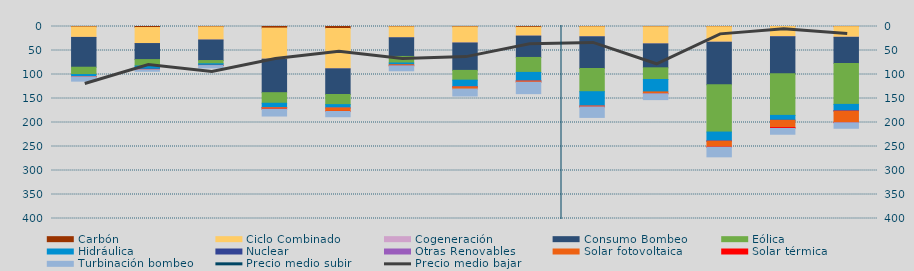
| Category | Carbón | Ciclo Combinado | Cogeneración | Consumo Bombeo | Eólica | Hidráulica | Nuclear | Otras Renovables | Solar fotovoltaica | Solar térmica | Turbinación bombeo |
|---|---|---|---|---|---|---|---|---|---|---|---|
| M | 916.05 | 21695.666 | 176.35 | 62054.792 | 15250.739 | 4379.143 | 0 | 39.1 | 143.784 | 110.5 | 9070.525 |
| J | 2154.975 | 33372.05 | 35.5 | 33404.025 | 13344.6 | 6713.425 | 395.875 | 16.375 | 385.65 | 221.25 | 3231.725 |
| J | 780.225 | 27400.075 | 8 | 42750.35 | 6759.125 | 3263.775 | 115 | 0 | 90.1 | 206.65 | 4895.275 |
| A | 3351.92 | 64804.475 | 20.75 | 69703.55 | 22031.853 | 9149.525 | 70.975 | 22.5 | 2685.85 | 505.375 | 14186.525 |
| S | 4138.5 | 84055.788 | 26 | 53462.35 | 21071.172 | 6988.753 | 0 | 0.85 | 7069.199 | 219.625 | 10948.251 |
| O | 766.425 | 22723.1 | 23.25 | 38873.508 | 13638.3 | 3548.975 | 0 | 0 | 2254.075 | 15.75 | 10421.953 |
| N | 882.249 | 33437.299 | 73.35 | 57054.7 | 20324.708 | 13802.882 | 172 | 5.375 | 4519.267 | 0 | 14514.075 |
| D | 1625.533 | 18353.308 | 50.675 | 44452.158 | 31169.809 | 17718.259 | 225.525 | 7.75 | 2457.35 | 4.225 | 23848.4 |
| E | 624.15 | 20714.774 | 137.817 | 66005.482 | 48358.133 | 29783.675 | 0 | 1 | 1942.858 | 28.625 | 21792.308 |
| F | 573.3 | 35655.65 | 48.25 | 49817.85 | 24354.625 | 25831 | 0 | 0 | 3770.725 | 69.225 | 12196.8 |
| M | 501.25 | 32124.392 | 164.517 | 88685.498 | 98417.968 | 18612.512 | 448.75 | 16.575 | 11880.15 | 572.625 | 20112.843 |
| A | 170 | 20766.184 | 571.725 | 76937.455 | 86761.121 | 10133.333 | 40.925 | 0 | 14988.025 | 2004.65 | 12082.525 |
| M | 320.375 | 21993.7 | 252.925 | 54297.65 | 85403.658 | 12766.317 | 1357.65 | 14.475 | 23573.033 | 453.85 | 11577.425 |